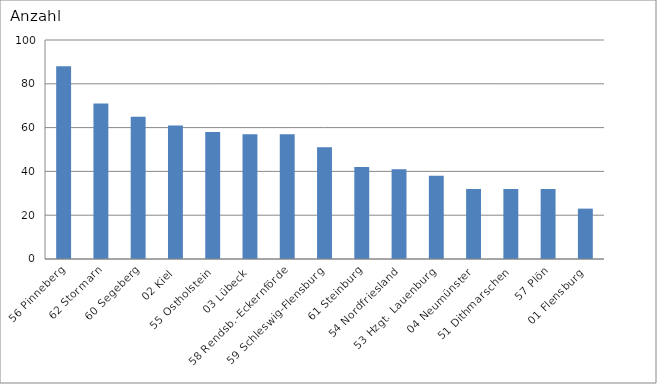
| Category | 56 Pinneberg 62 Stormarn 60 Segeberg 02 Kiel 55 Ostholstein 03 Lübeck 58 Rendsb.-Eckernförde 59 Schleswig-Flensburg 61 Steinburg 54 Nordfriesland 53 Hzgt. Lauenburg 04 Neumünster 51 Dithmarschen 57 Plön 01 Flensburg |
|---|---|
| 56 Pinneberg | 88 |
| 62 Stormarn | 71 |
| 60 Segeberg | 65 |
| 02 Kiel | 61 |
| 55 Ostholstein | 58 |
| 03 Lübeck | 57 |
| 58 Rendsb.-Eckernförde | 57 |
| 59 Schleswig-Flensburg | 51 |
| 61 Steinburg | 42 |
| 54 Nordfriesland | 41 |
| 53 Hzgt. Lauenburg | 38 |
| 04 Neumünster | 32 |
| 51 Dithmarschen | 32 |
| 57 Plön | 32 |
| 01 Flensburg | 23 |